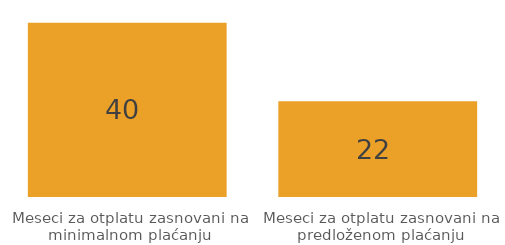
| Category | Series 0 |
|---|---|
| Meseci za otplatu zasnovani na minimalnom plaćanju | 40 |
| Meseci za otplatu zasnovani na predloženom plaćanju | 22 |